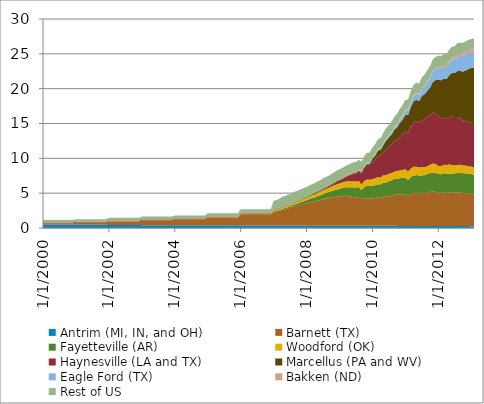
| Category | Antrim (MI, IN, and OH) | Barnett (TX) | Fayetteville (AR) | Woodford (OK) | Haynesville (LA and TX) | Marcellus (PA and WV) | Eagle Ford (TX) | Bakken (ND) | Rest of US |
|---|---|---|---|---|---|---|---|---|---|
| 1/1/00 | 0.481 | 0.184 | 0 | 0.009 | 0.128 | 0.001 | 0 | 0.005 | 0.332 |
| 2/1/00 | 0.481 | 0.184 | 0 | 0.009 | 0.128 | 0.001 | 0 | 0.005 | 0.332 |
| 3/1/00 | 0.481 | 0.184 | 0 | 0.009 | 0.128 | 0.001 | 0 | 0.005 | 0.332 |
| 4/1/00 | 0.481 | 0.184 | 0 | 0.009 | 0.128 | 0.001 | 0 | 0.005 | 0.332 |
| 5/1/00 | 0.481 | 0.184 | 0 | 0.009 | 0.128 | 0.001 | 0 | 0.005 | 0.332 |
| 6/1/00 | 0.481 | 0.184 | 0 | 0.009 | 0.128 | 0.001 | 0 | 0.005 | 0.332 |
| 7/1/00 | 0.481 | 0.184 | 0 | 0.009 | 0.128 | 0.001 | 0 | 0.005 | 0.332 |
| 8/1/00 | 0.481 | 0.184 | 0 | 0.009 | 0.128 | 0.001 | 0 | 0.005 | 0.332 |
| 9/1/00 | 0.481 | 0.184 | 0 | 0.009 | 0.128 | 0.001 | 0 | 0.005 | 0.332 |
| 10/1/00 | 0.481 | 0.184 | 0 | 0.009 | 0.128 | 0.001 | 0 | 0.005 | 0.332 |
| 11/1/00 | 0.481 | 0.184 | 0 | 0.009 | 0.128 | 0.001 | 0 | 0.005 | 0.332 |
| 12/1/00 | 0.481 | 0.184 | 0 | 0.009 | 0.128 | 0.001 | 0 | 0.005 | 0.332 |
| 1/1/01 | 0.461 | 0.314 | 0 | 0.009 | 0.125 | 0.001 | 0 | 0.005 | 0.359 |
| 2/1/01 | 0.461 | 0.314 | 0 | 0.009 | 0.125 | 0.001 | 0 | 0.005 | 0.359 |
| 3/1/01 | 0.461 | 0.314 | 0 | 0.009 | 0.125 | 0.001 | 0 | 0.005 | 0.359 |
| 4/1/01 | 0.461 | 0.314 | 0 | 0.009 | 0.125 | 0.001 | 0 | 0.005 | 0.359 |
| 5/1/01 | 0.461 | 0.314 | 0 | 0.009 | 0.125 | 0.001 | 0 | 0.005 | 0.359 |
| 6/1/01 | 0.461 | 0.314 | 0 | 0.009 | 0.125 | 0.001 | 0 | 0.005 | 0.359 |
| 7/1/01 | 0.461 | 0.314 | 0 | 0.009 | 0.125 | 0.001 | 0 | 0.005 | 0.359 |
| 8/1/01 | 0.461 | 0.314 | 0 | 0.009 | 0.125 | 0.001 | 0 | 0.005 | 0.359 |
| 9/1/01 | 0.461 | 0.314 | 0 | 0.009 | 0.125 | 0.001 | 0 | 0.005 | 0.359 |
| 10/1/01 | 0.461 | 0.314 | 0 | 0.009 | 0.125 | 0.001 | 0 | 0.005 | 0.359 |
| 11/1/01 | 0.461 | 0.314 | 0 | 0.009 | 0.125 | 0.001 | 0 | 0.005 | 0.359 |
| 12/1/01 | 0.461 | 0.314 | 0 | 0.009 | 0.125 | 0.001 | 0 | 0.005 | 0.359 |
| 1/1/02 | 0.438 | 0.508 | 0 | 0.009 | 0.121 | 0 | 0 | 0.004 | 0.39 |
| 2/1/02 | 0.438 | 0.508 | 0 | 0.009 | 0.121 | 0 | 0 | 0.004 | 0.39 |
| 3/1/02 | 0.438 | 0.508 | 0 | 0.009 | 0.121 | 0 | 0 | 0.004 | 0.39 |
| 4/1/02 | 0.438 | 0.508 | 0 | 0.009 | 0.121 | 0 | 0 | 0.004 | 0.39 |
| 5/1/02 | 0.438 | 0.508 | 0 | 0.009 | 0.121 | 0 | 0 | 0.004 | 0.39 |
| 6/1/02 | 0.438 | 0.508 | 0 | 0.009 | 0.121 | 0 | 0 | 0.004 | 0.39 |
| 7/1/02 | 0.438 | 0.508 | 0 | 0.009 | 0.121 | 0 | 0 | 0.004 | 0.39 |
| 8/1/02 | 0.438 | 0.508 | 0 | 0.009 | 0.121 | 0 | 0 | 0.004 | 0.39 |
| 9/1/02 | 0.438 | 0.508 | 0 | 0.009 | 0.121 | 0 | 0 | 0.004 | 0.39 |
| 10/1/02 | 0.438 | 0.508 | 0 | 0.009 | 0.121 | 0 | 0 | 0.004 | 0.39 |
| 11/1/02 | 0.438 | 0.508 | 0 | 0.009 | 0.121 | 0 | 0 | 0.004 | 0.39 |
| 12/1/02 | 0.438 | 0.508 | 0 | 0.009 | 0.121 | 0 | 0 | 0.004 | 0.39 |
| 1/1/03 | 0.405 | 0.706 | 0 | 0.01 | 0.106 | 0 | 0 | 0.004 | 0.414 |
| 2/1/03 | 0.405 | 0.706 | 0 | 0.01 | 0.106 | 0 | 0 | 0.004 | 0.414 |
| 3/1/03 | 0.405 | 0.706 | 0 | 0.01 | 0.106 | 0 | 0 | 0.004 | 0.414 |
| 4/1/03 | 0.405 | 0.706 | 0 | 0.01 | 0.106 | 0 | 0 | 0.004 | 0.414 |
| 5/1/03 | 0.405 | 0.706 | 0 | 0.01 | 0.106 | 0 | 0 | 0.004 | 0.414 |
| 6/1/03 | 0.405 | 0.706 | 0 | 0.01 | 0.106 | 0 | 0 | 0.004 | 0.414 |
| 7/1/03 | 0.405 | 0.706 | 0 | 0.01 | 0.106 | 0 | 0 | 0.004 | 0.414 |
| 8/1/03 | 0.405 | 0.706 | 0 | 0.01 | 0.106 | 0 | 0 | 0.004 | 0.414 |
| 9/1/03 | 0.405 | 0.706 | 0 | 0.01 | 0.106 | 0 | 0 | 0.004 | 0.414 |
| 10/1/03 | 0.405 | 0.706 | 0 | 0.01 | 0.106 | 0 | 0 | 0.004 | 0.414 |
| 11/1/03 | 0.405 | 0.706 | 0 | 0.01 | 0.106 | 0 | 0 | 0.004 | 0.414 |
| 12/1/03 | 0.405 | 0.706 | 0 | 0.01 | 0.106 | 0 | 0 | 0.004 | 0.414 |
| 1/1/04 | 0.391 | 0.857 | 0 | 0.015 | 0.097 | 0 | 0 | 0.004 | 0.437 |
| 2/1/04 | 0.391 | 0.857 | 0 | 0.015 | 0.097 | 0 | 0 | 0.004 | 0.437 |
| 3/1/04 | 0.391 | 0.857 | 0 | 0.015 | 0.097 | 0 | 0 | 0.004 | 0.437 |
| 4/1/04 | 0.391 | 0.857 | 0 | 0.015 | 0.097 | 0 | 0 | 0.004 | 0.437 |
| 5/1/04 | 0.391 | 0.857 | 0 | 0.015 | 0.097 | 0 | 0 | 0.004 | 0.437 |
| 6/1/04 | 0.391 | 0.857 | 0 | 0.015 | 0.097 | 0 | 0 | 0.004 | 0.437 |
| 7/1/04 | 0.391 | 0.857 | 0 | 0.015 | 0.097 | 0 | 0 | 0.004 | 0.437 |
| 8/1/04 | 0.391 | 0.857 | 0 | 0.015 | 0.097 | 0 | 0 | 0.004 | 0.437 |
| 9/1/04 | 0.391 | 0.857 | 0 | 0.015 | 0.097 | 0 | 0 | 0.004 | 0.437 |
| 10/1/04 | 0.391 | 0.857 | 0 | 0.015 | 0.097 | 0 | 0 | 0.004 | 0.437 |
| 11/1/04 | 0.391 | 0.857 | 0 | 0.015 | 0.097 | 0 | 0 | 0.004 | 0.437 |
| 12/1/04 | 0.391 | 0.857 | 0 | 0.015 | 0.097 | 0 | 0 | 0.004 | 0.437 |
| 1/1/05 | 0.381 | 1.134 | 0.006 | 0.025 | 0.091 | 0.002 | 0 | 0.005 | 0.459 |
| 2/1/05 | 0.381 | 1.134 | 0.006 | 0.025 | 0.091 | 0.002 | 0 | 0.005 | 0.459 |
| 3/1/05 | 0.381 | 1.134 | 0.006 | 0.025 | 0.091 | 0.002 | 0 | 0.005 | 0.459 |
| 4/1/05 | 0.381 | 1.134 | 0.006 | 0.025 | 0.091 | 0.002 | 0 | 0.005 | 0.459 |
| 5/1/05 | 0.381 | 1.134 | 0.006 | 0.025 | 0.091 | 0.002 | 0 | 0.005 | 0.459 |
| 6/1/05 | 0.381 | 1.134 | 0.006 | 0.025 | 0.091 | 0.002 | 0 | 0.005 | 0.459 |
| 7/1/05 | 0.381 | 1.134 | 0.006 | 0.025 | 0.091 | 0.002 | 0 | 0.005 | 0.459 |
| 8/1/05 | 0.381 | 1.134 | 0.006 | 0.025 | 0.091 | 0.002 | 0 | 0.005 | 0.459 |
| 9/1/05 | 0.381 | 1.134 | 0.006 | 0.025 | 0.091 | 0.002 | 0 | 0.005 | 0.459 |
| 10/1/05 | 0.381 | 1.134 | 0.006 | 0.025 | 0.091 | 0.002 | 0 | 0.005 | 0.459 |
| 11/1/05 | 0.381 | 1.134 | 0.006 | 0.025 | 0.091 | 0.002 | 0 | 0.005 | 0.459 |
| 12/1/05 | 0.381 | 1.134 | 0.006 | 0.025 | 0.091 | 0.002 | 0 | 0.005 | 0.459 |
| 1/1/06 | 0.373 | 1.61 | 0.04 | 0.071 | 0.082 | 0.012 | 0 | 0.007 | 0.506 |
| 2/1/06 | 0.373 | 1.61 | 0.04 | 0.071 | 0.082 | 0.012 | 0 | 0.007 | 0.506 |
| 3/1/06 | 0.373 | 1.61 | 0.04 | 0.071 | 0.082 | 0.012 | 0 | 0.007 | 0.506 |
| 4/1/06 | 0.373 | 1.61 | 0.04 | 0.071 | 0.082 | 0.012 | 0 | 0.007 | 0.506 |
| 5/1/06 | 0.373 | 1.61 | 0.04 | 0.071 | 0.082 | 0.012 | 0 | 0.007 | 0.506 |
| 6/1/06 | 0.373 | 1.61 | 0.04 | 0.071 | 0.082 | 0.012 | 0 | 0.007 | 0.506 |
| 7/1/06 | 0.373 | 1.61 | 0.04 | 0.071 | 0.082 | 0.012 | 0 | 0.007 | 0.506 |
| 8/1/06 | 0.373 | 1.61 | 0.04 | 0.071 | 0.082 | 0.012 | 0 | 0.007 | 0.506 |
| 9/1/06 | 0.373 | 1.61 | 0.04 | 0.071 | 0.082 | 0.012 | 0 | 0.007 | 0.506 |
| 10/1/06 | 0.373 | 1.61 | 0.04 | 0.071 | 0.082 | 0.012 | 0 | 0.007 | 0.506 |
| 11/1/06 | 0.373 | 1.61 | 0.04 | 0.071 | 0.082 | 0.012 | 0 | 0.007 | 0.506 |
| 12/1/06 | 0.373 | 1.61 | 0.04 | 0.071 | 0.082 | 0.012 | 0 | 0.007 | 0.506 |
| 1/1/07 | 0.362 | 1.921 | 0.099 | 0.131 | 0.081 | 0.02 | 0 | 0.009 | 1.272 |
| 2/1/07 | 0.362 | 1.999 | 0.115 | 0.146 | 0.081 | 0.022 | 0 | 0.009 | 1.272 |
| 3/1/07 | 0.362 | 2.123 | 0.138 | 0.166 | 0.079 | 0.023 | 0 | 0.009 | 1.272 |
| 4/1/07 | 0.363 | 2.208 | 0.157 | 0.176 | 0.077 | 0.024 | 0 | 0.013 | 1.434 |
| 5/1/07 | 0.363 | 2.33 | 0.171 | 0.173 | 0.078 | 0.024 | 0 | 0.013 | 1.434 |
| 6/1/07 | 0.363 | 2.41 | 0.193 | 0.189 | 0.078 | 0.026 | 0 | 0.013 | 1.434 |
| 7/1/07 | 0.36 | 2.523 | 0.227 | 0.21 | 0.077 | 0.026 | 0 | 0.016 | 1.453 |
| 8/1/07 | 0.36 | 2.692 | 0.26 | 0.231 | 0.078 | 0.025 | 0 | 0.016 | 1.453 |
| 9/1/07 | 0.36 | 2.769 | 0.288 | 0.257 | 0.08 | 0.029 | 0 | 0.016 | 1.453 |
| 10/1/07 | 0.358 | 2.869 | 0.329 | 0.283 | 0.081 | 0.031 | 0 | 0.019 | 1.426 |
| 11/1/07 | 0.358 | 2.989 | 0.376 | 0.296 | 0.081 | 0.034 | 0 | 0.019 | 1.426 |
| 12/1/07 | 0.358 | 3.086 | 0.405 | 0.322 | 0.081 | 0.036 | 0 | 0.019 | 1.426 |
| 1/1/08 | 0.338 | 3.224 | 0.436 | 0.339 | 0.085 | 0.036 | 0 | 0.015 | 1.411 |
| 2/1/08 | 0.338 | 3.325 | 0.493 | 0.363 | 0.083 | 0.057 | 0 | 0.015 | 1.411 |
| 3/1/08 | 0.338 | 3.398 | 0.564 | 0.393 | 0.084 | 0.077 | 0 | 0.015 | 1.411 |
| 4/1/08 | 0.337 | 3.467 | 0.598 | 0.427 | 0.096 | 0.09 | 0.001 | 0.022 | 1.415 |
| 5/1/08 | 0.337 | 3.602 | 0.633 | 0.474 | 0.102 | 0.109 | 0.001 | 0.022 | 1.415 |
| 6/1/08 | 0.337 | 3.674 | 0.683 | 0.511 | 0.103 | 0.117 | 0.002 | 0.022 | 1.415 |
| 7/1/08 | 0.339 | 3.765 | 0.737 | 0.55 | 0.115 | 0.136 | 0 | 0.029 | 1.423 |
| 8/1/08 | 0.339 | 3.908 | 0.791 | 0.561 | 0.128 | 0.14 | 0 | 0.029 | 1.423 |
| 9/1/08 | 0.339 | 3.917 | 0.874 | 0.616 | 0.151 | 0.139 | 0.002 | 0.029 | 1.423 |
| 10/1/08 | 0.333 | 4.068 | 0.902 | 0.644 | 0.184 | 0.148 | 0.004 | 0.037 | 1.439 |
| 11/1/08 | 0.333 | 4.12 | 0.952 | 0.692 | 0.248 | 0.149 | 0.004 | 0.037 | 1.439 |
| 12/1/08 | 0.333 | 4.152 | 1.034 | 0.751 | 0.347 | 0.155 | 0.004 | 0.037 | 1.439 |
| 1/1/09 | 0.326 | 4.178 | 1.109 | 0.773 | 0.402 | 0.134 | 0.005 | 0.039 | 1.457 |
| 2/1/09 | 0.326 | 4.274 | 1.131 | 0.805 | 0.488 | 0.096 | 0.008 | 0.039 | 1.457 |
| 3/1/09 | 0.326 | 4.3 | 1.196 | 0.832 | 0.586 | 0.111 | 0.011 | 0.039 | 1.457 |
| 4/1/09 | 0.327 | 4.259 | 1.282 | 0.839 | 0.739 | 0.115 | 0.014 | 0.048 | 1.449 |
| 5/1/09 | 0.327 | 4.181 | 1.343 | 0.838 | 0.885 | 0.121 | 0.018 | 0.048 | 1.449 |
| 6/1/09 | 0.327 | 4.122 | 1.417 | 0.853 | 1.05 | 0.12 | 0.023 | 0.048 | 1.449 |
| 7/1/09 | 0.331 | 4.066 | 1.384 | 0.875 | 1.19 | 0.122 | 0.031 | 0.058 | 1.416 |
| 8/1/09 | 0.331 | 3.996 | 1.59 | 0.844 | 1.398 | 0.131 | 0.041 | 0.058 | 1.416 |
| 9/1/09 | 0.331 | 3.942 | 1.14 | 0.835 | 1.587 | 0.14 | 0.052 | 0.058 | 1.416 |
| 10/1/09 | 0.323 | 3.971 | 1.585 | 0.88 | 1.866 | 0.145 | 0.075 | 0.062 | 1.387 |
| 11/1/09 | 0.323 | 3.954 | 1.773 | 0.903 | 2.129 | 0.144 | 0.108 | 0.062 | 1.387 |
| 12/1/09 | 0.323 | 3.935 | 1.815 | 0.851 | 2.181 | 0.131 | 0.108 | 0.062 | 1.387 |
| 1/1/10 | 0.312 | 3.963 | 1.811 | 0.921 | 2.444 | 0.474 | 0.119 | 0.08 | 1.415 |
| 2/1/10 | 0.312 | 3.988 | 1.841 | 0.994 | 2.654 | 0.628 | 0.127 | 0.08 | 1.415 |
| 3/1/10 | 0.312 | 4.085 | 1.898 | 1.029 | 3.014 | 0.786 | 0.139 | 0.08 | 1.415 |
| 4/1/10 | 0.308 | 3.949 | 2 | 1.008 | 3.111 | 0.858 | 0.157 | 0.101 | 1.438 |
| 5/1/10 | 0.308 | 4.189 | 2.028 | 1.065 | 3.316 | 1.025 | 0.192 | 0.101 | 1.438 |
| 6/1/10 | 0.308 | 4.157 | 2.071 | 1.05 | 3.661 | 1.309 | 0.237 | 0.101 | 1.438 |
| 7/1/10 | 0.308 | 4.268 | 2.142 | 1.059 | 3.94 | 1.279 | 0.245 | 0.122 | 1.424 |
| 8/1/10 | 0.308 | 4.314 | 2.228 | 1.013 | 4.172 | 1.433 | 0.278 | 0.122 | 1.424 |
| 9/1/10 | 0.308 | 4.467 | 2.259 | 1.058 | 4.374 | 1.647 | 0.323 | 0.122 | 1.424 |
| 10/1/10 | 0.305 | 4.479 | 2.284 | 1.12 | 4.436 | 1.822 | 0.36 | 0.138 | 1.447 |
| 11/1/10 | 0.305 | 4.534 | 2.317 | 1.11 | 4.808 | 2.04 | 0.413 | 0.138 | 1.447 |
| 12/1/10 | 0.305 | 4.55 | 2.378 | 1.102 | 5.145 | 2.074 | 0.536 | 0.138 | 1.447 |
| 1/1/11 | 0.299 | 4.517 | 2.373 | 1.244 | 5.415 | 2.379 | 0.598 | 0.123 | 1.435 |
| 2/1/11 | 0.299 | 4.257 | 2.345 | 1.2 | 5.61 | 2.537 | 0.645 | 0.123 | 1.435 |
| 3/1/11 | 0.299 | 4.645 | 2.412 | 1.17 | 6.089 | 2.78 | 0.722 | 0.123 | 1.435 |
| 4/1/11 | 0.292 | 4.714 | 2.529 | 1.266 | 6.344 | 3.017 | 0.776 | 0.137 | 1.48 |
| 5/1/11 | 0.292 | 4.774 | 2.532 | 1.198 | 6.56 | 3.063 | 0.842 | 0.137 | 1.48 |
| 6/1/11 | 0.292 | 4.711 | 2.536 | 1.139 | 6.477 | 3.062 | 0.883 | 0.137 | 1.48 |
| 7/1/11 | 0.295 | 4.69 | 2.565 | 1.204 | 6.652 | 3.555 | 0.964 | 0.181 | 1.53 |
| 8/1/11 | 0.295 | 4.73 | 2.565 | 1.133 | 6.91 | 3.579 | 1.087 | 0.181 | 1.53 |
| 9/1/11 | 0.295 | 4.84 | 2.661 | 1.065 | 7.054 | 3.772 | 1.245 | 0.181 | 1.53 |
| 10/1/11 | 0.291 | 4.879 | 2.696 | 1.213 | 7.118 | 3.961 | 1.326 | 0.22 | 1.55 |
| 11/1/11 | 0.291 | 4.972 | 2.682 | 1.316 | 7.313 | 4.417 | 1.457 | 0.22 | 1.55 |
| 12/1/11 | 0.291 | 4.894 | 2.702 | 1.302 | 7.231 | 4.805 | 1.566 | 0.22 | 1.55 |
| 1/1/12 | 0.284 | 4.789 | 2.71 | 1.127 | 7.186 | 5.178 | 1.628 | 0.256 | 1.581 |
| 2/1/12 | 0.284 | 4.746 | 2.685 | 1.18 | 6.818 | 5.494 | 1.634 | 0.256 | 1.581 |
| 3/1/12 | 0.284 | 4.878 | 2.722 | 1.196 | 6.762 | 5.63 | 1.691 | 0.256 | 1.581 |
| 4/1/12 | 0.279 | 4.764 | 2.756 | 1.229 | 6.703 | 5.655 | 1.7 | 0.294 | 1.595 |
| 5/1/12 | 0.279 | 4.829 | 2.734 | 1.313 | 6.781 | 6.007 | 1.821 | 0.294 | 1.595 |
| 6/1/12 | 0.279 | 4.773 | 2.737 | 1.238 | 6.95 | 6.278 | 1.887 | 0.294 | 1.595 |
| 7/1/12 | 0.275 | 4.851 | 2.733 | 1.171 | 6.887 | 6.333 | 1.961 | 0.356 | 1.542 |
| 8/1/12 | 0.275 | 4.824 | 2.818 | 1.133 | 6.888 | 6.601 | 2.105 | 0.356 | 1.542 |
| 9/1/12 | 0.275 | 4.814 | 2.846 | 1.139 | 6.701 | 6.76 | 2.173 | 0.356 | 1.542 |
| 10/1/12 | 0.271 | 4.749 | 2.855 | 1.108 | 6.446 | 7.029 | 2.249 | 0.422 | 1.463 |
| 11/1/12 | 0.271 | 4.716 | 2.863 | 1.091 | 6.406 | 7.28 | 2.297 | 0.422 | 1.463 |
| 12/1/12 | 0.271 | 4.687 | 2.846 | 1.075 | 6.334 | 7.612 | 2.281 | 0.422 | 1.463 |
| 1/1/13 | 0.266 | 4.663 | 2.819 | 1.065 | 6.295 | 7.867 | 2.311 | 0.497 | 1.369 |
| 2/1/13 | 0.266 | 4.631 | 2.729 | 1.053 | 6.284 | 8.041 | 2.33 | 0.497 | 1.369 |